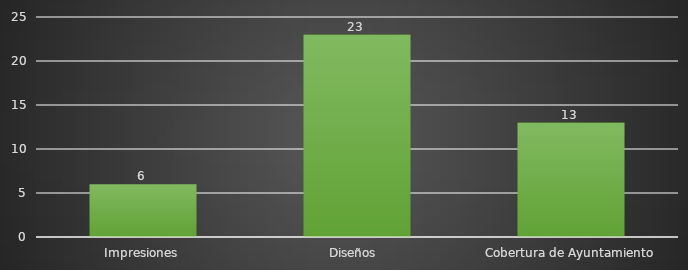
| Category | INDICADOR  |
|---|---|
| Impresiones | 6 |
| Diseños  | 23 |
| Cobertura de Ayuntamiento | 13 |